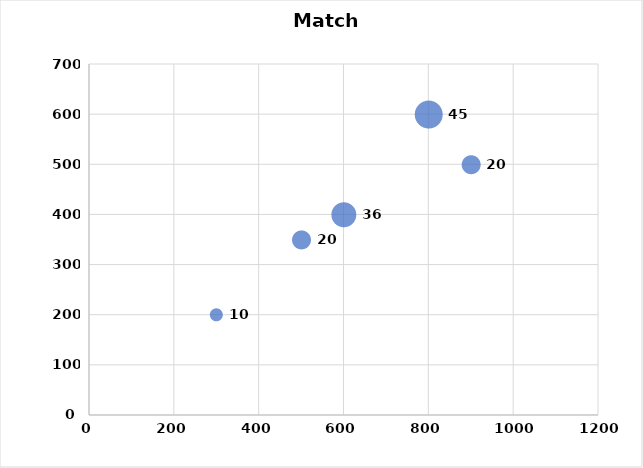
| Category | Series 0 |
|---|---|
| 300.0 | 200 |
| 500.0 | 350 |
| 600.0 | 400 |
| 800.0 | 600 |
| 900.0 | 500 |
| 300.0 | 200 |
| 500.0 | 350 |
| 600.0 | 400 |
| 800.0 | 600 |
| 900.0 | 500 |